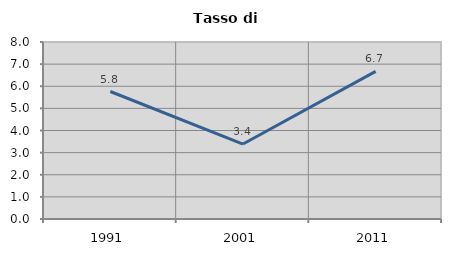
| Category | Tasso di disoccupazione   |
|---|---|
| 1991.0 | 5.763 |
| 2001.0 | 3.388 |
| 2011.0 | 6.674 |